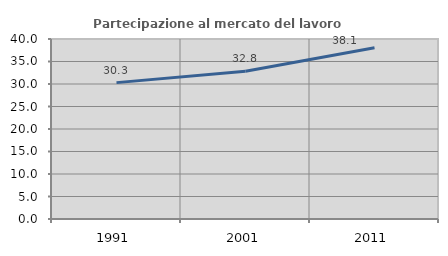
| Category | Partecipazione al mercato del lavoro  femminile |
|---|---|
| 1991.0 | 30.306 |
| 2001.0 | 32.811 |
| 2011.0 | 38.067 |